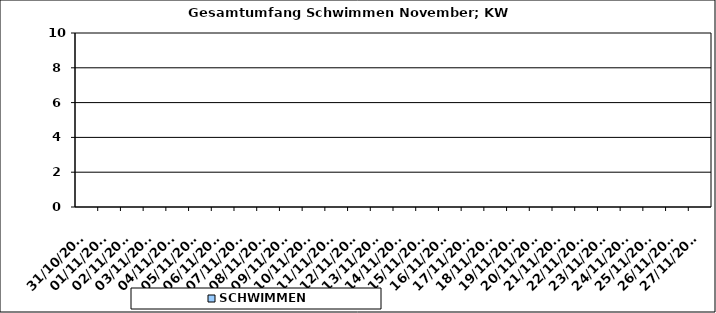
| Category | SCHWIMMEN |
|---|---|
| 31/10/2022 | 0 |
| 01/11/2022 | 0 |
| 02/11/2022 | 0 |
| 03/11/2022 | 0 |
| 04/11/2022 | 0 |
| 05/11/2022 | 0 |
| 06/11/2022 | 0 |
| 07/11/2022 | 0 |
| 08/11/2022 | 0 |
| 09/11/2022 | 0 |
| 10/11/2022 | 0 |
| 11/11/2022 | 0 |
| 12/11/2022 | 0 |
| 13/11/2022 | 0 |
| 14/11/2022 | 0 |
| 15/11/2022 | 0 |
| 16/11/2022 | 0 |
| 17/11/2022 | 0 |
| 18/11/2022 | 0 |
| 19/11/2022 | 0 |
| 20/11/2022 | 0 |
| 21/11/2022 | 0 |
| 22/11/2022 | 0 |
| 23/11/2022 | 0 |
| 24/11/2022 | 0 |
| 25/11/2022 | 0 |
| 26/11/2022 | 0 |
| 27/11/2022 | 0 |